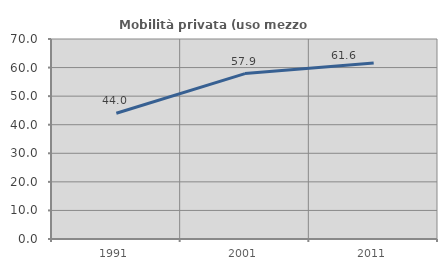
| Category | Mobilità privata (uso mezzo privato) |
|---|---|
| 1991.0 | 44.008 |
| 2001.0 | 57.884 |
| 2011.0 | 61.616 |